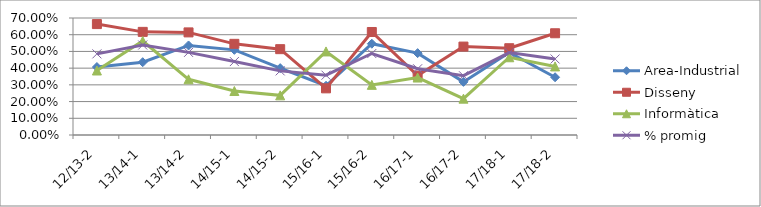
| Category | Area-Industrial | Disseny | Informàtica | % promig |
|---|---|---|---|---|
| 12/13-2 | 0.407 | 0.664 | 0.386 | 0.485 |
| 13/14-1 | 0.436 | 0.617 | 0.562 | 0.538 |
| 13/14-2 | 0.536 | 0.614 | 0.333 | 0.494 |
| 14/15-1 | 0.509 | 0.545 | 0.263 | 0.439 |
| 14/15-2 | 0.4 | 0.514 | 0.237 | 0.384 |
| 15/16-1 | 0.295 | 0.279 | 0.5 | 0.358 |
| 15/16-2 | 0.546 | 0.616 | 0.3 | 0.487 |
| 16/17-1 | 0.49 | 0.356 | 0.344 | 0.396 |
| 16/17-2 | 0.318 | 0.529 | 0.217 | 0.355 |
| 17/18-1 | 0.494 | 0.519 | 0.465 | 0.493 |
| 17/18-2 | 0.345 | 0.609 | 0.41 | 0.455 |